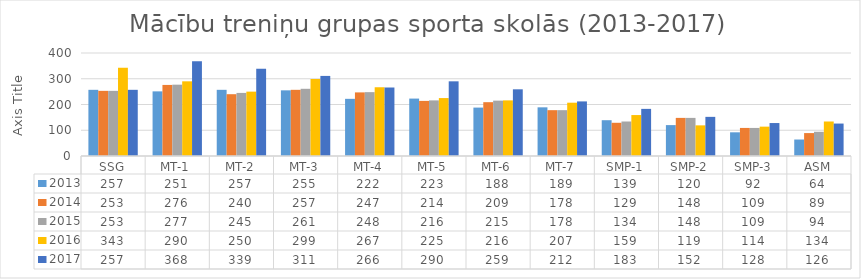
| Category | 2013 | 2014 | 2015 | 2016 | 2017 |
|---|---|---|---|---|---|
| SSG | 257 | 253 | 253 | 343 | 257 |
| MT-1 | 251 | 276 | 277 | 290 | 368 |
| MT-2 | 257 | 240 | 245 | 250 | 339 |
| MT-3 | 255 | 257 | 261 | 299 | 311 |
| MT-4 | 222 | 247 | 248 | 267 | 266 |
| MT-5 | 223 | 214 | 216 | 225 | 290 |
| MT-6 | 188 | 209 | 215 | 216 | 259 |
| MT-7 | 189 | 178 | 178 | 207 | 212 |
| SMP-1 | 139 | 129 | 134 | 159 | 183 |
| SMP-2 | 120 | 148 | 148 | 119 | 152 |
| SMP-3 | 92 | 109 | 109 | 114 | 128 |
| ASM | 64 | 89 | 94 | 134 | 126 |